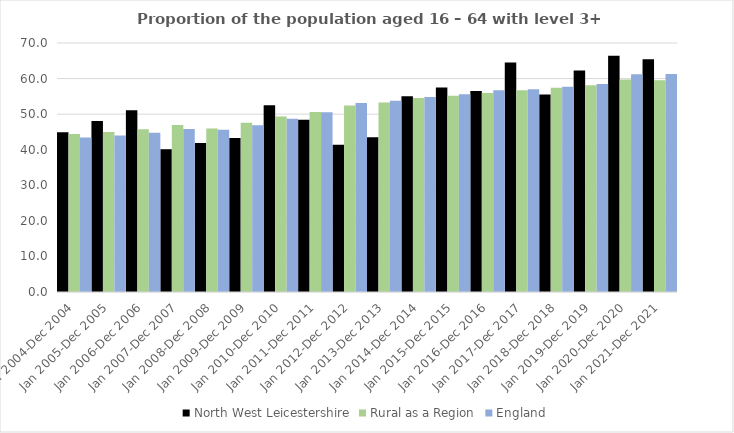
| Category | North West Leicestershire | Rural as a Region | England |
|---|---|---|---|
| Jan 2004-Dec 2004 | 44.9 | 44.405 | 43.4 |
| Jan 2005-Dec 2005 | 48.1 | 44.973 | 44 |
| Jan 2006-Dec 2006 | 51.1 | 45.774 | 44.8 |
| Jan 2007-Dec 2007 | 40.1 | 46.968 | 45.8 |
| Jan 2008-Dec 2008 | 41.9 | 45.964 | 45.6 |
| Jan 2009-Dec 2009 | 43.3 | 47.59 | 46.9 |
| Jan 2010-Dec 2010 | 52.5 | 49.362 | 48.7 |
| Jan 2011-Dec 2011 | 48.4 | 50.602 | 50.5 |
| Jan 2012-Dec 2012 | 41.4 | 52.439 | 53.1 |
| Jan 2013-Dec 2013 | 43.5 | 53.276 | 53.8 |
| Jan 2014-Dec 2014 | 55 | 54.57 | 54.8 |
| Jan 2015-Dec 2015 | 57.5 | 55.16 | 55.6 |
| Jan 2016-Dec 2016 | 56.5 | 55.941 | 56.7 |
| Jan 2017-Dec 2017 | 64.5 | 56.689 | 57 |
| Jan 2018-Dec 2018 | 55.5 | 57.389 | 57.7 |
| Jan 2019-Dec 2019 | 62.3 | 58.147 | 58.5 |
| Jan 2020-Dec 2020 | 66.4 | 59.771 | 61.2 |
| Jan 2021-Dec 2021 | 65.4 | 59.54 | 61.3 |